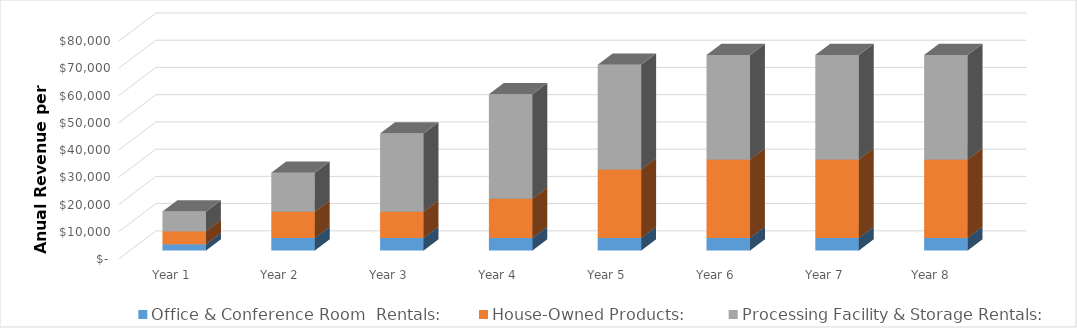
| Category | Office & Conference Room  Rentals: | House-Owned Products:  | Processing Facility & Storage Rentals:  |
|---|---|---|---|
| Year 1 | 2304 | 4800 | 7200 |
| Year 2 | 4608 | 9600 | 14400 |
| Year 3 | 4608 | 9600 | 28800 |
| Year 4 | 4608 | 14400 | 38400 |
| Year 5 | 4608 | 25200 | 38400 |
| Year 6 | 4608 | 28800 | 38400 |
| Year 7 | 4608 | 28800 | 38400 |
| Year 8  | 4608 | 28800 | 38400 |